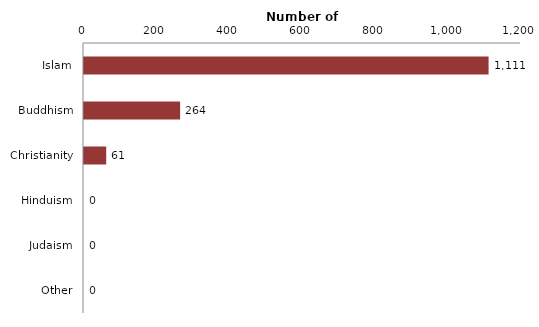
| Category | Series 0 |
|---|---|
| Islam | 1111 |
| Buddhism | 264 |
| Christianity | 61 |
| Hinduism | 0 |
| Judaism | 0 |
| Other | 0 |